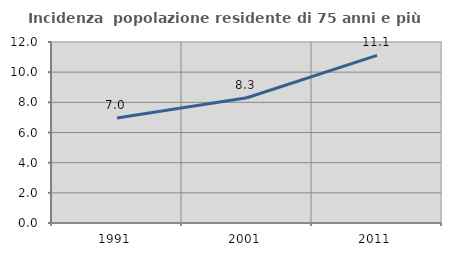
| Category | Incidenza  popolazione residente di 75 anni e più |
|---|---|
| 1991.0 | 6.959 |
| 2001.0 | 8.307 |
| 2011.0 | 11.115 |